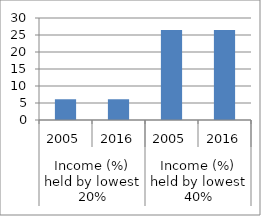
| Category | Series 0 |
|---|---|
| 0 | 6.1 |
| 1 | 6.1 |
| 2 | 26.5 |
| 3 | 26.5 |